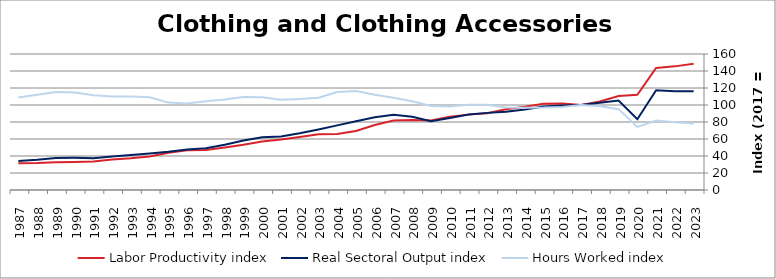
| Category | Labor Productivity index | Real Sectoral Output index | Hours Worked index |
|---|---|---|---|
| 2023.0 | 148.464 | 116.257 | 78.307 |
| 2022.0 | 145.45 | 116.032 | 79.774 |
| 2021.0 | 143.578 | 117.404 | 81.77 |
| 2020.0 | 112.064 | 83.226 | 74.267 |
| 2019.0 | 110.678 | 105.277 | 95.12 |
| 2018.0 | 104.176 | 102.628 | 98.514 |
| 2017.0 | 100 | 100 | 100 |
| 2016.0 | 101.868 | 99.524 | 97.7 |
| 2015.0 | 101.361 | 98.253 | 96.934 |
| 2014.0 | 97.884 | 94.774 | 96.822 |
| 2013.0 | 95.001 | 92.099 | 96.945 |
| 2012.0 | 90.392 | 90.735 | 100.379 |
| 2011.0 | 88.678 | 88.872 | 100.218 |
| 2010.0 | 86.266 | 84.789 | 98.288 |
| 2009.0 | 81.846 | 80.944 | 98.898 |
| 2008.0 | 82.485 | 86.153 | 104.447 |
| 2007.0 | 81.676 | 88.634 | 108.519 |
| 2006.0 | 76.404 | 85.61 | 112.05 |
| 2005.0 | 69.511 | 80.983 | 116.504 |
| 2004.0 | 65.931 | 76.01 | 115.288 |
| 2003.0 | 65.638 | 71.279 | 108.594 |
| 2002.0 | 62.429 | 66.79 | 106.986 |
| 2001.0 | 59.365 | 63.066 | 106.235 |
| 2000.0 | 57.006 | 62.159 | 109.038 |
| 1999.0 | 53.322 | 58.324 | 109.381 |
| 1998.0 | 50.03 | 53.291 | 106.519 |
| 1997.0 | 47.077 | 49.127 | 104.354 |
| 1996.0 | 46.826 | 47.691 | 101.849 |
| 1995.0 | 43.732 | 44.965 | 102.819 |
| 1994.0 | 39.462 | 43.069 | 109.14 |
| 1993.0 | 37.372 | 41.088 | 109.944 |
| 1992.0 | 35.866 | 39.439 | 109.96 |
| 1991.0 | 33.565 | 37.451 | 111.578 |
| 1990.0 | 32.957 | 37.797 | 114.687 |
| 1989.0 | 32.693 | 37.663 | 115.2 |
| 1988.0 | 31.748 | 35.603 | 112.143 |
| 1987.0 | 31.369 | 34.098 | 108.702 |